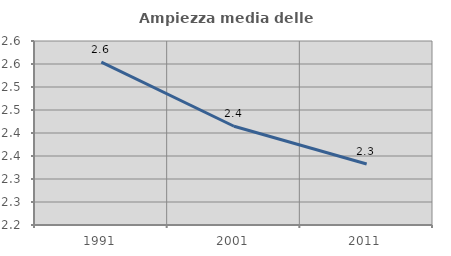
| Category | Ampiezza media delle famiglie |
|---|---|
| 1991.0 | 2.554 |
| 2001.0 | 2.415 |
| 2011.0 | 2.332 |